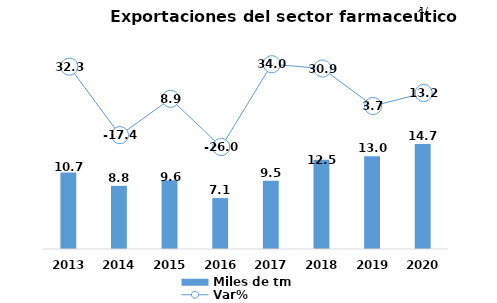
| Category | Miles de tm |
|---|---|
| 2013.0 | 10.7 |
| 2014.0 | 8.837 |
| 2015.0 | 9.627 |
| 2016.0 | 7.124 |
| 2017.0 | 9.548 |
| 2018.0 | 12.501 |
| 2019.0 | 12.969 |
| 2020.0 | 14.677 |